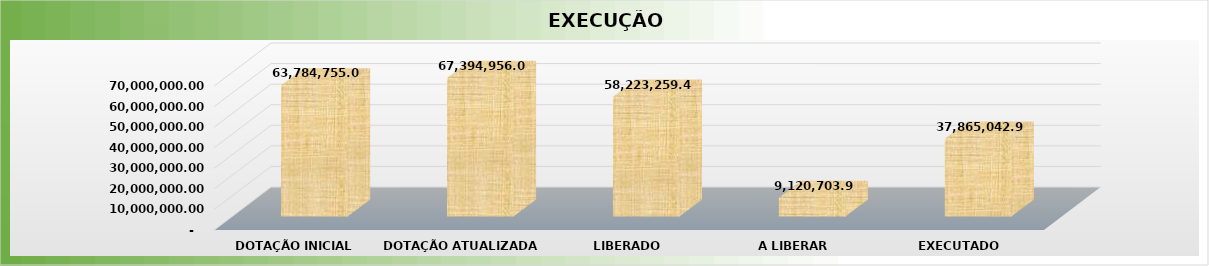
| Category | Series 0 |
|---|---|
| 0 | 63784755 |
| 1 | 67394956.09 |
| 2 | 58223259.47 |
| 3 | 9120703.92 |
| 4 | 37865042.94 |